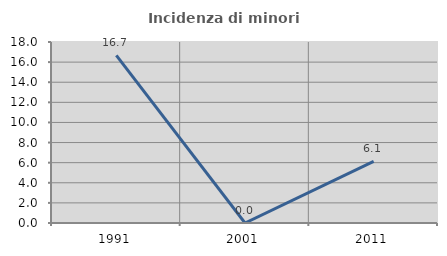
| Category | Incidenza di minori stranieri |
|---|---|
| 1991.0 | 16.667 |
| 2001.0 | 0 |
| 2011.0 | 6.122 |